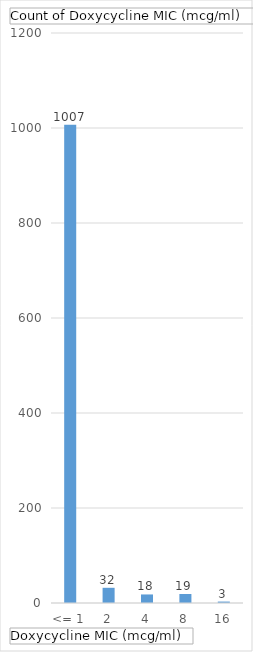
| Category | Total |
|---|---|
| <= 1 | 1007 |
| 2 | 32 |
| 4 | 18 |
| 8 | 19 |
| 16 | 3 |